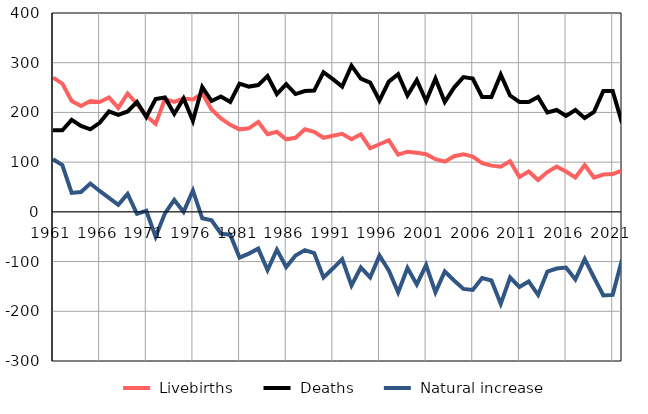
| Category |  Livebirths |  Deaths |  Natural increase |
|---|---|---|---|
| 1961.0 | 270 | 164 | 106 |
| 1962.0 | 258 | 164 | 94 |
| 1963.0 | 223 | 185 | 38 |
| 1964.0 | 213 | 173 | 40 |
| 1965.0 | 223 | 166 | 57 |
| 1966.0 | 221 | 179 | 42 |
| 1967.0 | 230 | 202 | 28 |
| 1968.0 | 209 | 195 | 14 |
| 1969.0 | 238 | 202 | 36 |
| 1970.0 | 217 | 221 | -4 |
| 1971.0 | 193 | 191 | 2 |
| 1972.0 | 177 | 227 | -50 |
| 1973.0 | 227 | 230 | -3 |
| 1974.0 | 221 | 197 | 24 |
| 1975.0 | 228 | 228 | 0 |
| 1976.0 | 226 | 183 | 43 |
| 1977.0 | 238 | 251 | -13 |
| 1978.0 | 206 | 223 | -17 |
| 1979.0 | 188 | 232 | -44 |
| 1980.0 | 175 | 221 | -46 |
| 1981.0 | 166 | 258 | -92 |
| 1982.0 | 168 | 252 | -84 |
| 1983.0 | 181 | 255 | -74 |
| 1984.0 | 156 | 273 | -117 |
| 1985.0 | 161 | 237 | -76 |
| 1986.0 | 146 | 257 | -111 |
| 1987.0 | 149 | 237 | -88 |
| 1988.0 | 166 | 243 | -77 |
| 1989.0 | 161 | 244 | -83 |
| 1990.0 | 149 | 281 | -132 |
| 1991.0 | 153 | 267 | -114 |
| 1992.0 | 157 | 252 | -95 |
| 1993.0 | 146 | 294 | -148 |
| 1994.0 | 156 | 268 | -112 |
| 1995.0 | 128 | 260 | -132 |
| 1996.0 | 136 | 224 | -88 |
| 1997.0 | 144 | 262 | -118 |
| 1998.0 | 115 | 277 | -162 |
| 1999.0 | 121 | 234 | -113 |
| 2000.0 | 119 | 265 | -146 |
| 2001.0 | 116 | 223 | -107 |
| 2002.0 | 106 | 268 | -162 |
| 2003.0 | 101 | 221 | -120 |
| 2004.0 | 112 | 250 | -138 |
| 2005.0 | 116 | 271 | -155 |
| 2006.0 | 111 | 268 | -157 |
| 2007.0 | 98 | 231 | -133 |
| 2008.0 | 93 | 231 | -138 |
| 2009.0 | 91 | 276 | -185 |
| 2010.0 | 102 | 234 | -132 |
| 2011.0 | 70 | 221 | -151 |
| 2012.0 | 81 | 221 | -140 |
| 2013.0 | 64 | 231 | -167 |
| 2014.0 | 80 | 200 | -120 |
| 2015.0 | 91 | 205 | -114 |
| 2016.0 | 81 | 193 | -112 |
| 2017.0 | 69 | 205 | -136 |
| 2018.0 | 94 | 189 | -95 |
| 2019.0 | 69 | 201 | -132 |
| 2020.0 | 75 | 243 | -168 |
| 2021.0 | 76 | 243 | -167 |
| 2022.0 | 83 | 179 | -96 |